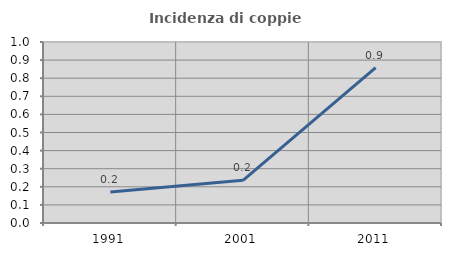
| Category | Incidenza di coppie miste |
|---|---|
| 1991.0 | 0.172 |
| 2001.0 | 0.236 |
| 2011.0 | 0.859 |